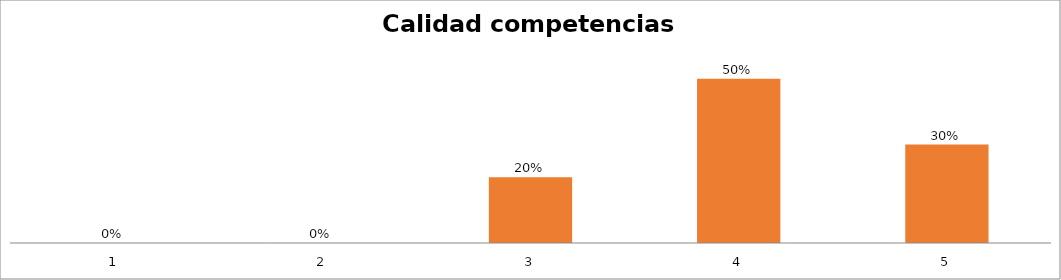
| Category | Series 1 |
|---|---|
| 0 | 0 |
| 1 | 0 |
| 2 | 0.2 |
| 3 | 0.5 |
| 4 | 0.3 |